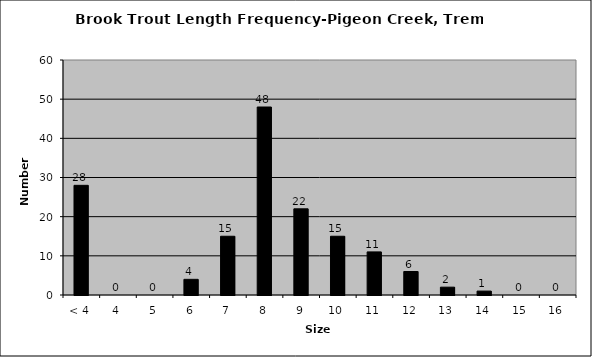
| Category | Series 0 |
|---|---|
| < 4 | 28 |
| 4 | 0 |
| 5 | 0 |
| 6 | 4 |
| 7 | 15 |
| 8 | 48 |
| 9 | 22 |
| 10 | 15 |
| 11 | 11 |
| 12 | 6 |
| 13 | 2 |
| 14 | 1 |
| 15 | 0 |
| 16 | 0 |